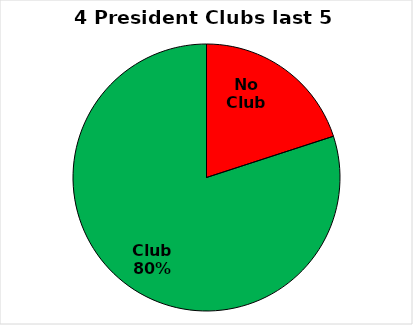
| Category | Series 0 |
|---|---|
| No Club | 0.2 |
| Club | 0.8 |